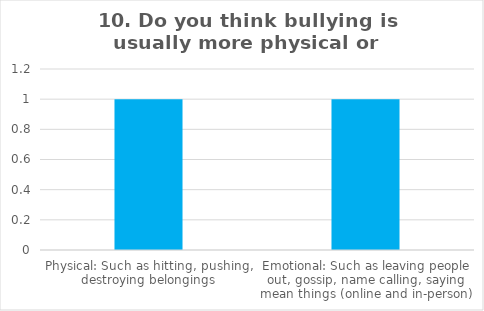
| Category | Series 0 |
|---|---|
| Physical: Such as hitting, pushing, destroying belongings | 1 |
| Emotional: Such as leaving people out, gossip, name calling, saying mean things (online and in-person) | 1 |